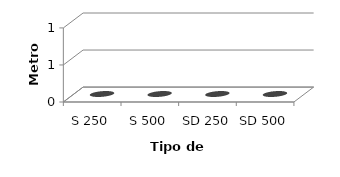
| Category | Series 0 |
|---|---|
| S 250 | 0 |
| S 500 | 0 |
| SD 250 | 0 |
| SD 500 | 0 |